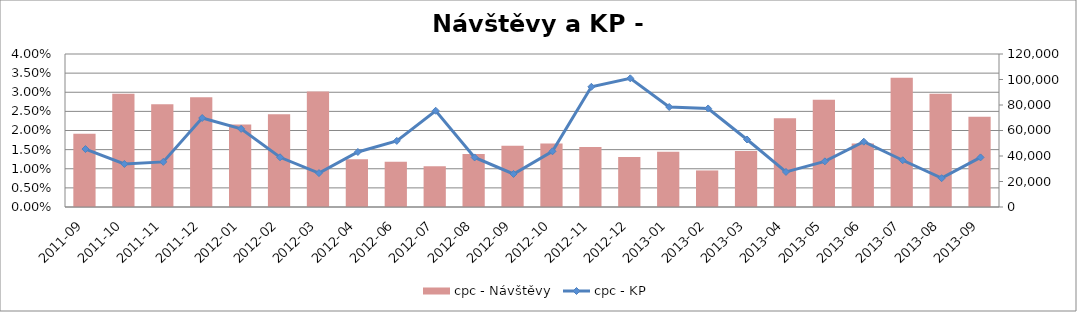
| Category | cpc - Návštěvy |
|---|---|
| 2011-09 | 57415.461 |
| 2011-10 | 88771.556 |
| 2011-11 | 80601.824 |
| 2011-12 | 86099.583 |
| 2012-01 | 64738.582 |
| 2012-02 | 72783.469 |
| 2012-03 | 90537.585 |
| 2012-04 | 37370.494 |
| 2012-06 | 35491.964 |
| 2012-07 | 31954.702 |
| 2012-08 | 41634.542 |
| 2012-09 | 48071.729 |
| 2012-10 | 49719.818 |
| 2012-11 | 47064.433 |
| 2012-12 | 39248.546 |
| 2013-01 | 43237.762 |
| 2013-02 | 28669.914 |
| 2013-03 | 43867.694 |
| 2013-04 | 69657.034 |
| 2013-05 | 84121.455 |
| 2013-06 | 49720.775 |
| 2013-07 | 101439.133 |
| 2013-08 | 88825.709 |
| 2013-09 | 70700.271 |